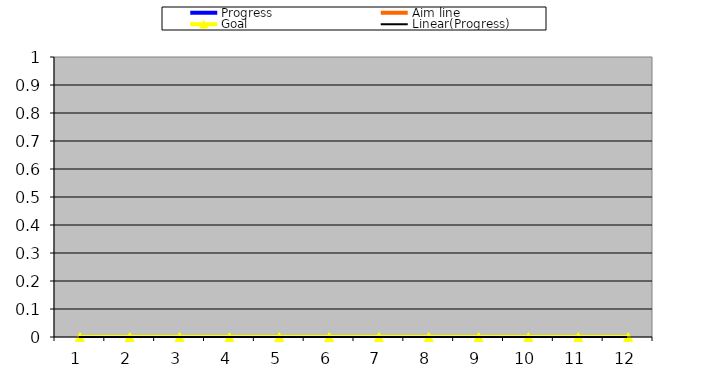
| Category | Progress | Aim line | Goal |
|---|---|---|---|
| 0 |  | 0 | 0 |
| 1 |  | 0 | 0 |
| 2 |  | 0 | 0 |
| 3 |  | 0 | 0 |
| 4 |  | 0 | 0 |
| 5 |  | 0 | 0 |
| 6 |  | 0 | 0 |
| 7 |  | 0 | 0 |
| 8 |  | 0 | 0 |
| 9 |  | 0 | 0 |
| 10 |  | 0 | 0 |
| 11 |  | 0 | 0 |